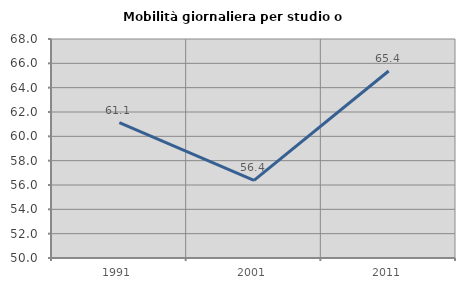
| Category | Mobilità giornaliera per studio o lavoro |
|---|---|
| 1991.0 | 61.118 |
| 2001.0 | 56.381 |
| 2011.0 | 65.369 |